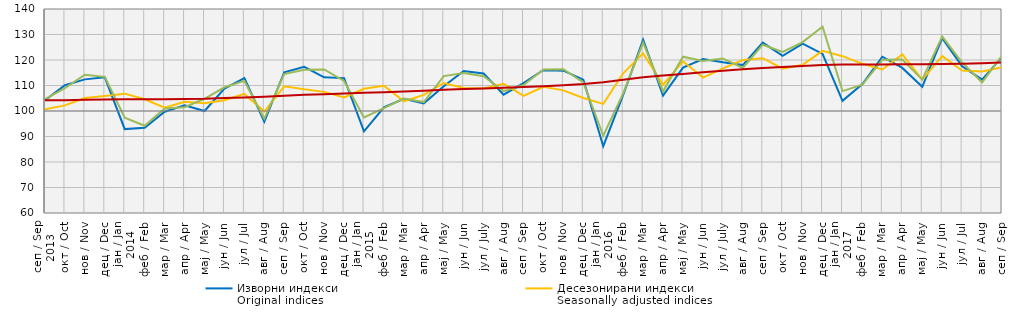
| Category | Изворни индекси
Original indices | Десезонирани индекси
Seasonally adjusted indices | Календарски прилагођени индекси
Working-day adjusted indices | Тренд
Trend |
|---|---|---|---|---|
| 0 | 104.2 | 100.7 | 104.7 | 104.2 |
| 1 | 110.1 | 102.2 | 109 | 104.2 |
| 2 | 112.4 | 105.1 | 114.2 | 104.4 |
| 3 | 113.2 | 105.9 | 113.4 | 104.5 |
| 4 | 92.9 | 106.8 | 97.4 | 104.6 |
| 5 | 93.4 | 104.6 | 94.2 | 104.6 |
| 6 | 99.7 | 101.3 | 101 | 104.6 |
| 7 | 102.2 | 103.6 | 101.5 | 104.7 |
| 8 | 100 | 103 | 104.8 | 104.8 |
| 9 | 108.8 | 104.2 | 109.3 | 105.1 |
| 10 | 112.9 | 106.7 | 111.8 | 105.3 |
| 11 | 95.8 | 99.8 | 97 | 105.6 |
| 12 | 115.2 | 109.7 | 114.5 | 106 |
| 13 | 117.3 | 108.5 | 116.2 | 106.4 |
| 14 | 113.2 | 107.5 | 116.3 | 106.6 |
| 15 | 112.9 | 105.3 | 111.8 | 106.9 |
| 16 | 92 | 108.7 | 97.5 | 107.2 |
| 17 | 101.4 | 109.9 | 101.1 | 107.4 |
| 18 | 104.8 | 103.8 | 104.9 | 107.6 |
| 19 | 103 | 106.3 | 103.5 | 107.9 |
| 20 | 109.7 | 111 | 113.7 | 108.3 |
| 21 | 115.7 | 109 | 114.9 | 108.6 |
| 22 | 114.7 | 108.8 | 113.6 | 108.8 |
| 23 | 106.4 | 110.7 | 107.8 | 109.1 |
| 24 | 110.9 | 105.9 | 110.2 | 109.4 |
| 25 | 116.1 | 109.5 | 116.3 | 109.7 |
| 26 | 115.8 | 108.1 | 116.4 | 110.1 |
| 27 | 112.3 | 105.1 | 111.2 | 110.6 |
| 28 | 86.2 | 102.8 | 90.3 | 111.3 |
| 29 | 106.3 | 114.8 | 106.9 | 112.3 |
| 30 | 128 | 122.6 | 126.8 | 113.2 |
| 31 | 106 | 110.3 | 107.7 | 113.9 |
| 32 | 117 | 119.5 | 121.3 | 114.5 |
| 33 | 120.4 | 113.1 | 119.6 | 115.2 |
| 34 | 119.1 | 116.7 | 120.6 | 115.8 |
| 35 | 118 | 120 | 116.9 | 116.4 |
| 36 | 126.8 | 120.7 | 126 | 116.9 |
| 37 | 121.6 | 116.6 | 123.2 | 117.3 |
| 38 | 126.4 | 118.1 | 127 | 117.6 |
| 39 | 122.4 | 123.6 | 133.1 | 118 |
| 40 | 104 | 121.5 | 107.8 | 118.2 |
| 41 | 110.6 | 118.5 | 110.3 | 118.2 |
| 42 | 121.3 | 116.3 | 120.1 | 118.2 |
| 43 | 116.9 | 122.2 | 120.2 | 118.3 |
| 44 | 109.5 | 112.3 | 112.3 | 118.3 |
| 45 | 128.6 | 121.5 | 129.2 | 118.4 |
| 46 | 117.5 | 115.9 | 119 | 118.5 |
| 47 | 112.3 | 115.5 | 111.2 | 118.7 |
| 48 | 121.1 | 117.1 | 121.7 | 119 |